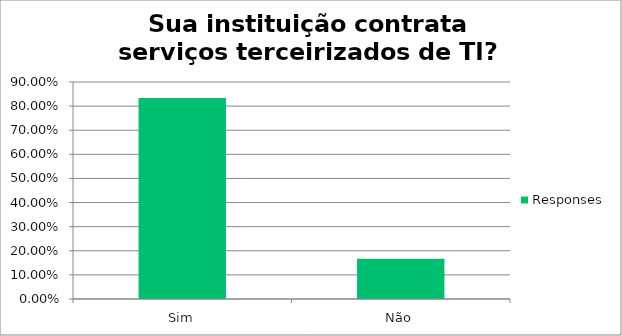
| Category | Responses |
|---|---|
| Sim | 0.833 |
| Não | 0.167 |